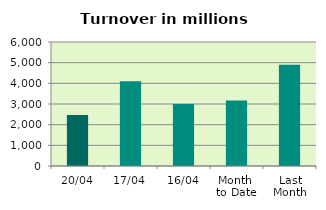
| Category | Series 0 |
|---|---|
| 20/04 | 2468.365 |
| 17/04 | 4094.894 |
| 16/04 | 3004.058 |
| Month 
to Date | 3174.661 |
| Last
Month | 4897.629 |